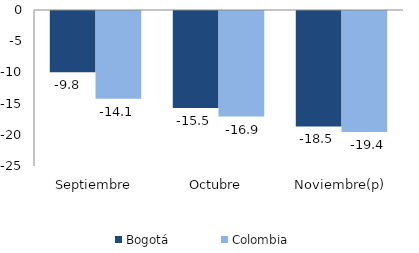
| Category | Bogotá | Colombia |
|---|---|---|
| Septiembre | -9.825 | -14.063 |
| Octubre | -15.536 | -16.909 |
| Noviembre(p) | -18.508 | -19.384 |